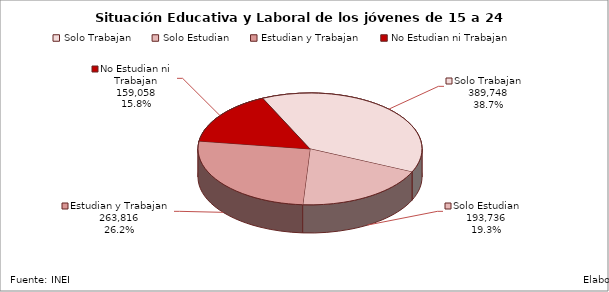
| Category | Series 0 |
|---|---|
| Solo Trabajan | 389747.69 |
| Solo Estudian | 193735.63 |
| Estudian y Trabajan | 263816.32 |
| No Estudian ni Trabajan | 159057.74 |